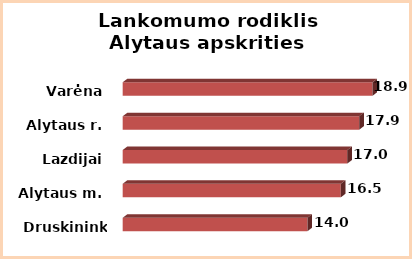
| Category | Series 0 |
|---|---|
| Druskininkai | 13.98 |
| Alytaus m. | 16.5 |
| Lazdijai | 17 |
| Alytaus r. | 17.9 |
| Varėna | 18.9 |